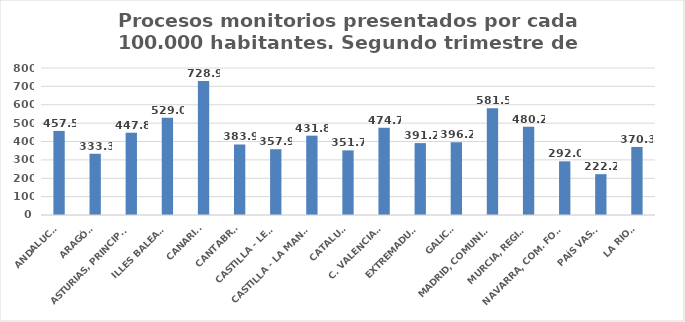
| Category | Series 0 |
|---|---|
| ANDALUCÍA | 457.536 |
| ARAGÓN | 333.265 |
| ASTURIAS, PRINCIPADO | 447.823 |
| ILLES BALEARS | 529.031 |
| CANARIAS | 728.897 |
| CANTABRIA | 383.873 |
| CASTILLA - LEÓN | 357.917 |
| CASTILLA - LA MANCHA | 431.831 |
| CATALUÑA | 351.737 |
| C. VALENCIANA | 474.708 |
| EXTREMADURA | 391.211 |
| GALICIA | 396.178 |
| MADRID, COMUNIDAD | 581.506 |
| MURCIA, REGIÓN | 480.191 |
| NAVARRA, COM. FORAL | 291.972 |
| PAÍS VASCO | 222.231 |
| LA RIOJA | 370.273 |